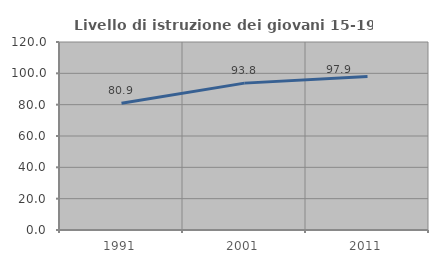
| Category | Livello di istruzione dei giovani 15-19 anni |
|---|---|
| 1991.0 | 80.864 |
| 2001.0 | 93.75 |
| 2011.0 | 97.909 |